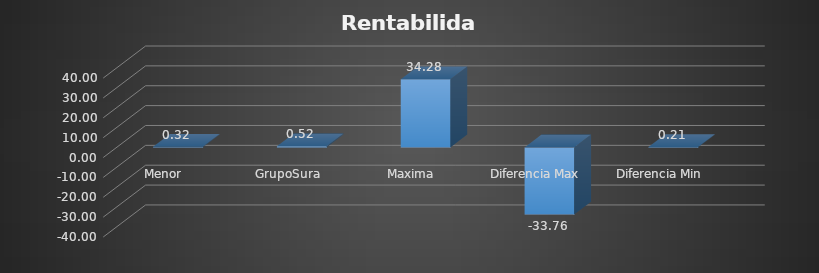
| Category | Series 0 |
|---|---|
| Menor | 0.319 |
| GrupoSura | 0.524 |
| Maxima | 34.284 |
| Diferencia Max | -33.76 |
| Diferencia Min | 0.205 |